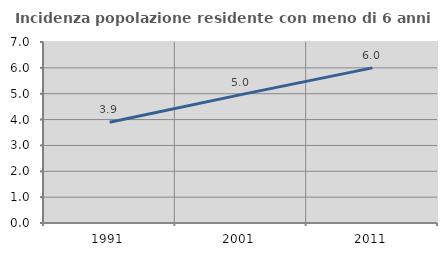
| Category | Incidenza popolazione residente con meno di 6 anni |
|---|---|
| 1991.0 | 3.895 |
| 2001.0 | 4.966 |
| 2011.0 | 5.999 |